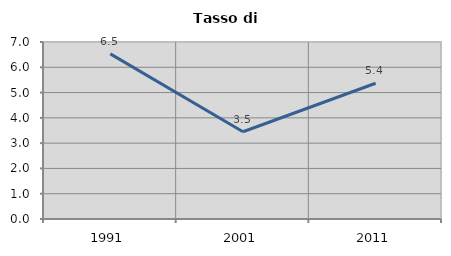
| Category | Tasso di disoccupazione   |
|---|---|
| 1991.0 | 6.53 |
| 2001.0 | 3.45 |
| 2011.0 | 5.368 |